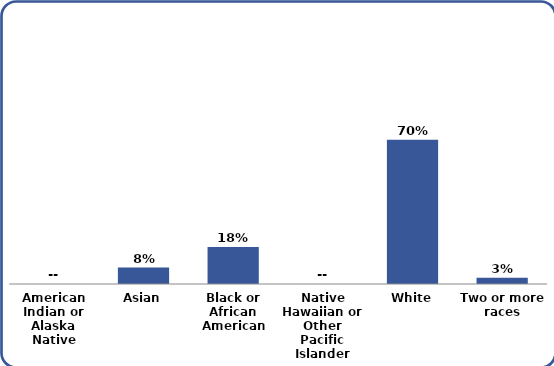
| Category | Series 0 |
|---|---|
| American Indian or Alaska Native | 0 |
| Asian | 0.08 |
| Black or African American | 0.18 |
| Native Hawaiian or Other Pacific Islander | 0 |
| White | 0.7 |
| Two or more races | 0.03 |